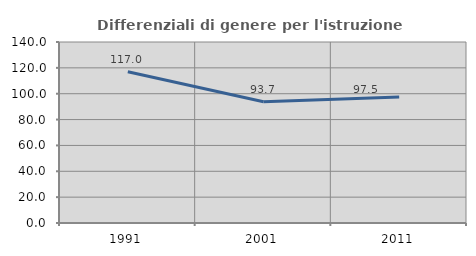
| Category | Differenziali di genere per l'istruzione superiore |
|---|---|
| 1991.0 | 117.002 |
| 2001.0 | 93.74 |
| 2011.0 | 97.459 |